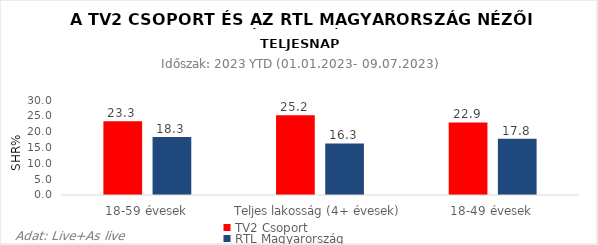
| Category | TV2 Csoport | RTL Magyarország |
|---|---|---|
| 18-59 évesek | 23.3 | 18.3 |
| Teljes lakosság (4+ évesek) | 25.2 | 16.3 |
| 18-49 évesek | 22.9 | 17.8 |